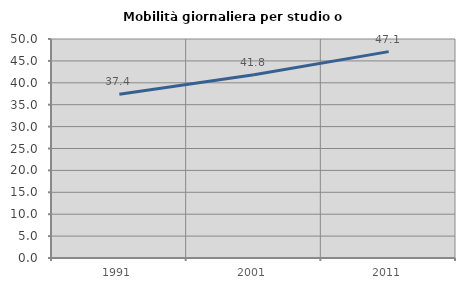
| Category | Mobilità giornaliera per studio o lavoro |
|---|---|
| 1991.0 | 37.366 |
| 2001.0 | 41.849 |
| 2011.0 | 47.118 |